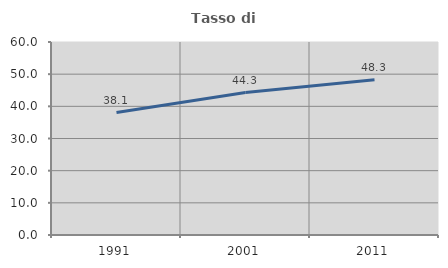
| Category | Tasso di occupazione   |
|---|---|
| 1991.0 | 38.056 |
| 2001.0 | 44.3 |
| 2011.0 | 48.276 |